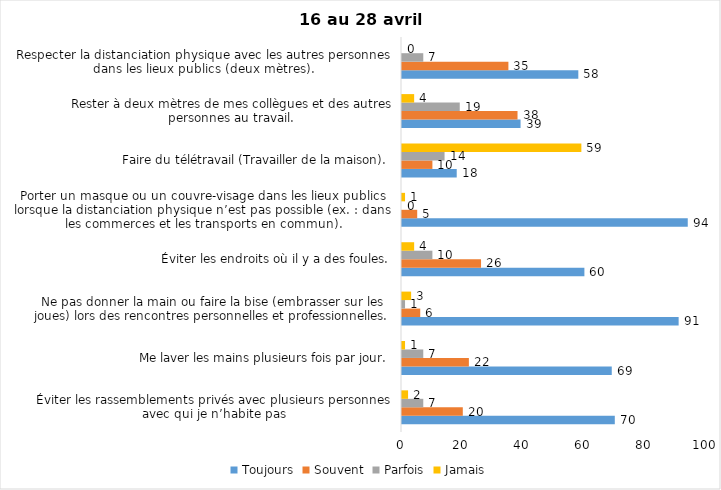
| Category | Toujours | Souvent | Parfois | Jamais |
|---|---|---|---|---|
| Éviter les rassemblements privés avec plusieurs personnes avec qui je n’habite pas | 70 | 20 | 7 | 2 |
| Me laver les mains plusieurs fois par jour. | 69 | 22 | 7 | 1 |
| Ne pas donner la main ou faire la bise (embrasser sur les joues) lors des rencontres personnelles et professionnelles. | 91 | 6 | 1 | 3 |
| Éviter les endroits où il y a des foules. | 60 | 26 | 10 | 4 |
| Porter un masque ou un couvre-visage dans les lieux publics lorsque la distanciation physique n’est pas possible (ex. : dans les commerces et les transports en commun). | 94 | 5 | 0 | 1 |
| Faire du télétravail (Travailler de la maison). | 18 | 10 | 14 | 59 |
| Rester à deux mètres de mes collègues et des autres personnes au travail. | 39 | 38 | 19 | 4 |
| Respecter la distanciation physique avec les autres personnes dans les lieux publics (deux mètres). | 58 | 35 | 7 | 0 |